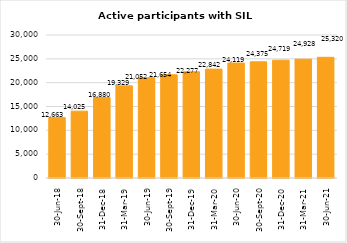
| Category | Active participants with SIL supports |
|---|---|
| 2018-06-30 | 12663 |
| 2018-09-30 | 14025 |
| 2018-12-31 | 16880 |
| 2019-03-31 | 19329 |
| 2019-06-30 | 21052 |
| 2019-09-30 | 21654 |
| 2019-12-31 | 22277 |
| 2020-03-31 | 22842 |
| 2020-06-30 | 24119 |
| 2020-09-30 | 24375 |
| 2020-12-31 | 24719 |
| 2021-03-31 | 24928 |
| 2021-06-30 | 25320 |